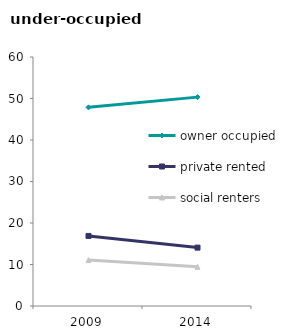
| Category | owner occupied | private rented | social renters |
|---|---|---|---|
| 2009.0 | 47.867 | 16.884 | 11.061 |
| 2014.0 | 50.33 | 14.069 | 9.441 |